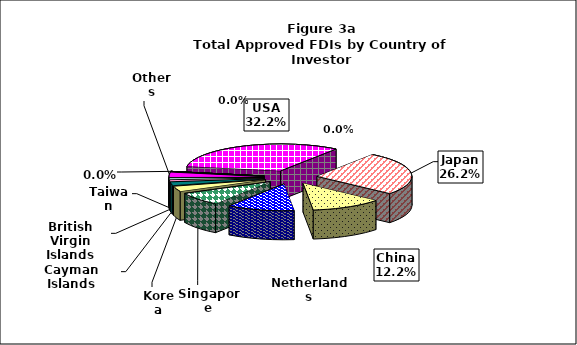
| Category | Series 0 |
|---|---|
| USA | 0.322 |
| Japan | 0.262 |
| China | 0.122 |
| Netherlands | 0.115 |
| Singapore | 0.081 |
| Korea | 0.032 |
| Cayman Islands | 0.02 |
| British Virgin Islands | 0.009 |
| Taiwan | 0.009 |
| Others | 0.029 |